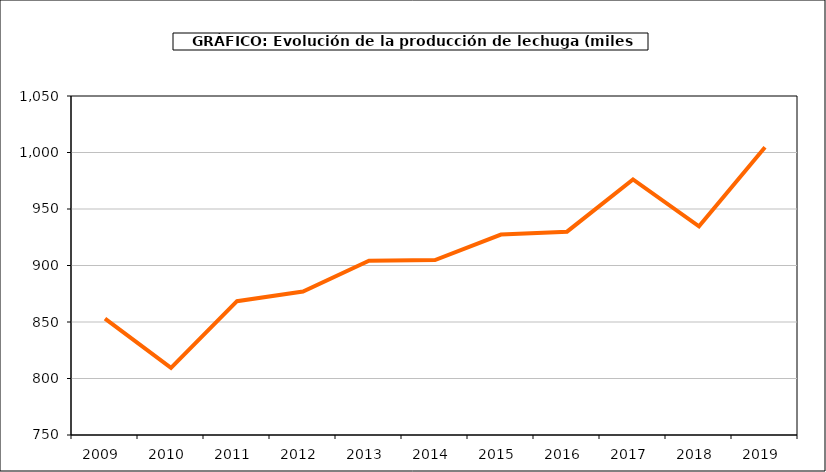
| Category | producción |
|---|---|
| 2009.0 | 852.988 |
| 2010.0 | 809.39 |
| 2011.0 | 868.436 |
| 2012.0 | 876.926 |
| 2013.0 | 904.283 |
| 2014.0 | 904.802 |
| 2015.0 | 927.378 |
| 2016.0 | 929.944 |
| 2017.0 | 976.112 |
| 2018.0 | 934.67 |
| 2019.0 | 1004.668 |